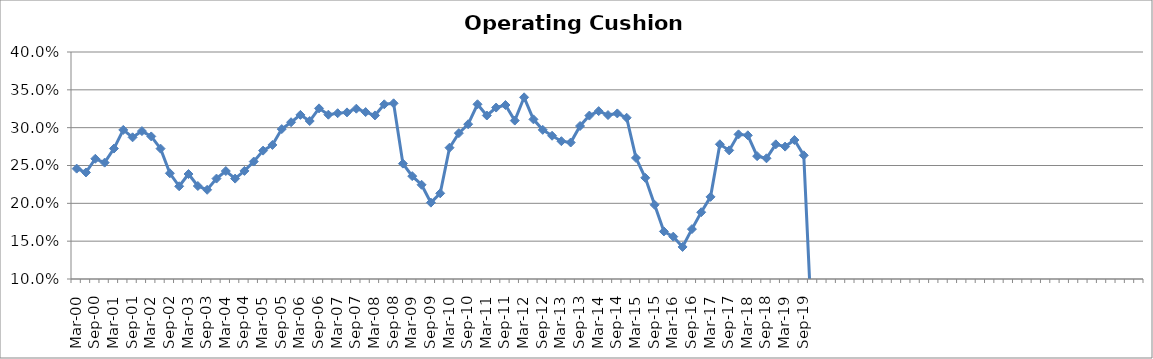
| Category | Operating Cushion % |
|---|---|
| Mar-00 | 0.246 |
| Jun-00 | 0.241 |
| Sep-00 | 0.259 |
| Dec-00 | 0.254 |
| Mar-01 | 0.272 |
| Jun-01 | 0.297 |
| Sep-01 | 0.287 |
| Dec-01 | 0.295 |
| Mar-02 | 0.288 |
| Jun-02 | 0.272 |
| Sep-02 | 0.24 |
| Dec-02 | 0.223 |
| Mar-03 | 0.239 |
| Jun-03 | 0.223 |
| Sep-03 | 0.218 |
| Dec-03 | 0.233 |
| Mar-04 | 0.243 |
| Jun-04 | 0.233 |
| Sep-04 | 0.243 |
| Dec-04 | 0.255 |
| Mar-05 | 0.27 |
| Jun-05 | 0.277 |
| Sep-05 | 0.298 |
| Dec-05 | 0.307 |
| Mar-06 | 0.317 |
| Jun-06 | 0.309 |
| Sep-06 | 0.326 |
| Dec-06 | 0.317 |
| Mar-07 | 0.319 |
| Jun-07 | 0.32 |
| Sep-07 | 0.325 |
| Dec-07 | 0.321 |
| Mar-08 | 0.316 |
| Jun-08 | 0.331 |
| Sep-08 | 0.332 |
| Dec-08 | 0.252 |
| Mar-09 | 0.236 |
| Jun-09 | 0.225 |
| Sep-09 | 0.201 |
| Dec-09 | 0.213 |
| Mar-10 | 0.274 |
| Jun-10 | 0.293 |
| Sep-10 | 0.305 |
| Dec-10 | 0.331 |
| Mar-11 | 0.316 |
| Jun-11 | 0.327 |
| Sep-11 | 0.33 |
| Dec-11 | 0.309 |
| Mar-12 | 0.34 |
| Jun-12 | 0.311 |
| Sep-12 | 0.297 |
| Dec-12 | 0.289 |
| Mar-13 | 0.282 |
| Jun-13 | 0.28 |
| Sep-13 | 0.302 |
| Dec-13 | 0.316 |
| Mar-14 | 0.322 |
| Jun-14 | 0.317 |
| Sep-14 | 0.319 |
| Dec-14 | 0.313 |
| Mar-15 | 0.26 |
| Jun-15 | 0.234 |
| Sep-15 | 0.198 |
| Dec-15 | 0.163 |
| Mar-16 | 0.156 |
| Jun-16 | 0.142 |
| Sep-16 | 0.166 |
| Dec-16 | 0.188 |
| Mar-17 | 0.209 |
| Jun-17 | 0.278 |
| Sep-17 | 0.27 |
| Dec-17 | 0.291 |
| Mar-18 | 0.29 |
| Jun-18 | 0.262 |
| Sep-18 | 0.26 |
| Dec-18 | 0.278 |
| Mar-19 | 0.275 |
| Jun-19 | 0.284 |
| Sep-19 | 0.263 |